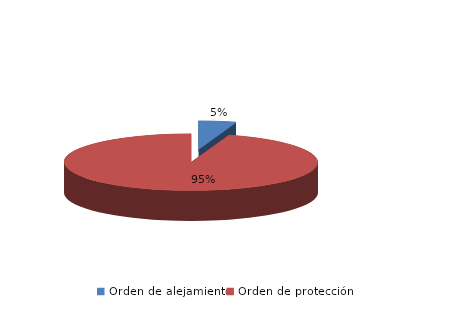
| Category | Series 0 |
|---|---|
| Orden de alejamiento | 3 |
| Orden de protección | 60 |